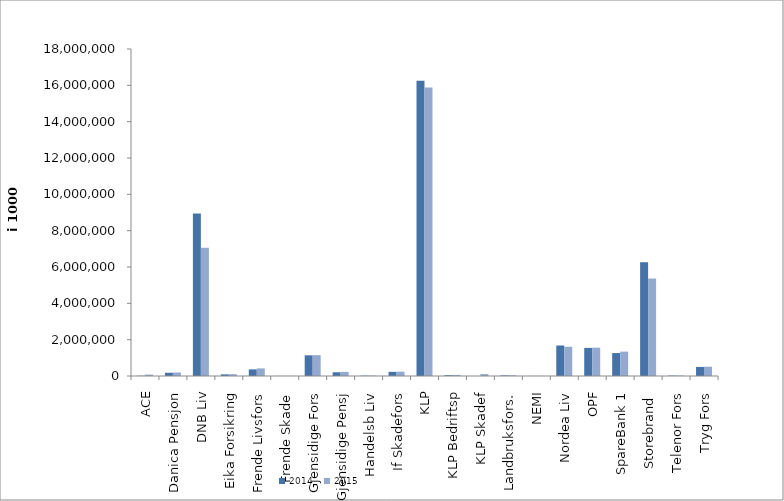
| Category | 2014 | 2015 |
|---|---|---|
| ACE | 13367 | 78123.6 |
| Danica Pensjon | 178885.164 | 191202.681 |
| DNB Liv | 8947232 | 7065772.463 |
| Eika Forsikring | 90075 | 101000 |
| Frende Livsfors | 364696 | 418681 |
| Frende Skade | 3466 | 3480 |
| Gjensidige Fors | 1139128 | 1147821 |
| Gjensidige Pensj | 205363.767 | 226186.261 |
| Handelsb Liv | 17705 | 21113 |
| If Skadefors | 227784 | 237735.09 |
| KLP | 16257940.452 | 15886395.104 |
| KLP Bedriftsp | 45221 | 60739 |
| KLP Skadef | 0 | 105293.125 |
| Landbruksfors. | 34993.36 | 40550 |
| NEMI | 2479 | 2609 |
| Nordea Liv | 1679769.604 | 1607888.38 |
| OPF | 1547364 | 1559758 |
| SpareBank 1 | 1264159.037 | 1343495.907 |
| Storebrand  | 6268178.093 | 5360124.083 |
| Telenor Fors | 22319 | 24715 |
| Tryg Fors | 498797.969 | 511210.573 |